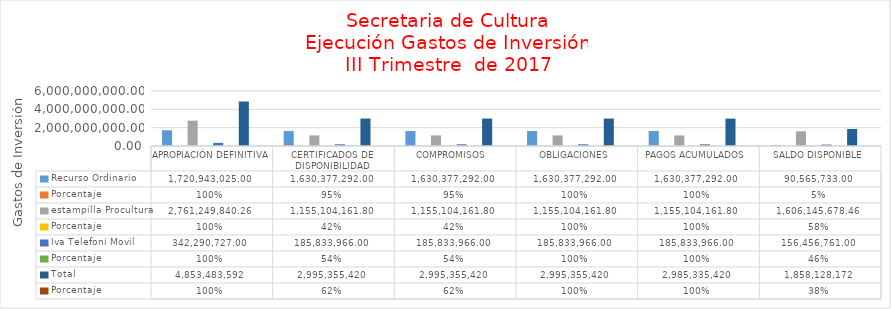
| Category | Recurso Ordinario | Porcentaje | estampilla Procultura | Iva Telefoni Movil  | Total |
|---|---|---|---|---|---|
| APROPIACIÓN DEFINITIVA  | 1720943025 | 1 | 2761249840.26 | 342290727 | 4853483592.26 |
| CERTIFICADOS DE DISPONIBILIDAD | 1630377292 | 0.617 | 1155104161.8 | 185833966 | 2995355419.8 |
| COMPROMISOS  | 1630377292 | 0.617 | 1155104161.8 | 185833966 | 2995355419.8 |
| OBLIGACIONES | 1630377292 | 1 | 1155104161.8 | 185833966 | 2995355419.8 |
| PAGOS ACUMULADOS | 1630377292 | 0.997 | 1155104161.8 | 185833966 | 2985335419.8 |
| SALDO DISPONIBLE | 90565733 | 0.383 | 1606145678.46 | 156456761 | 1858128172.46 |